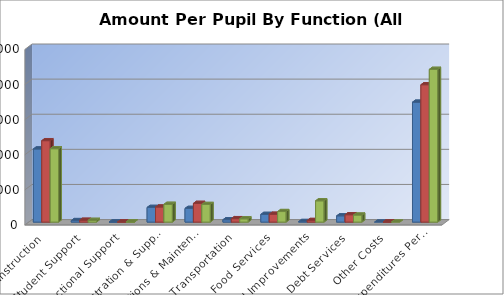
| Category | 2014-2015 | 2015-2016 | 2016-2017 |
|---|---|---|---|
| Instruction | 10412.731 | 11595.056 | 10449.93 |
| Student Support | 215.327 | 257.573 | 243.486 |
| Instructional Support | 9.987 | 17.693 | 16.796 |
| Administration & Support | 2088.065 | 2142.854 | 2528.979 |
| Operations & Maintenance | 1947.883 | 2662.037 | 2510.359 |
| Transportation | 334.803 | 488.037 | 468.31 |
| Food Services | 1093.663 | 1116.187 | 1501.761 |
| Capital Improvements | 83.424 | 228.345 | 3031.69 |
| Debt Services | 889.696 | 1046.876 | 999 |
| Other Costs | 0 | 6.906 | 0 |
| Total Expenditures Per Pupil** | 17075.579 | 19561.566 | 21750.31 |